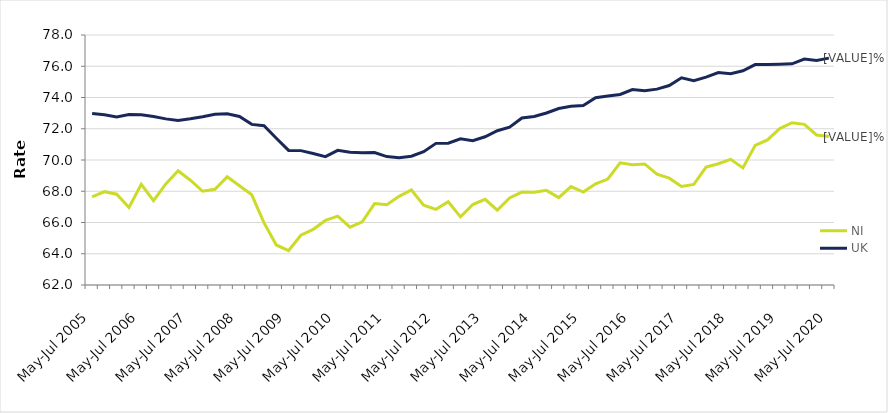
| Category | NI | UK |
|---|---|---|
| May-Jul 2005 | 67.645 | 72.97 |
| Aug-Oct 2005 | 67.974 | 72.901 |
| Nov-Jan 2006 | 67.813 | 72.757 |
| Feb-Apr 2006 | 66.965 | 72.911 |
| May-Jul 2006 | 68.442 | 72.894 |
| Aug-Oct 2006 | 67.397 | 72.779 |
| Nov-Jan 2007 | 68.468 | 72.632 |
| Feb-Apr 2007 | 69.313 | 72.535 |
| May-Jul 2007 | 68.706 | 72.637 |
| Aug-Oct 2007 | 68 | 72.767 |
| Nov-Jan 2008 | 68.125 | 72.932 |
| Feb-Apr 2008 | 68.922 | 72.964 |
| May-Jul 2008 | 68.347 | 72.787 |
| Aug-Oct 2008 | 67.774 | 72.28 |
| Nov-Jan 2009 | 65.977 | 72.194 |
| Feb-Apr 2009 | 64.562 | 71.396 |
| May-Jul 2009 | 64.206 | 70.615 |
| Aug-Oct 2009 | 65.187 | 70.6 |
| Nov-Jan 2010 | 65.558 | 70.416 |
| Feb-Apr 2010 | 66.133 | 70.214 |
| May-Jul 2010 | 66.41 | 70.621 |
| Aug-Oct 2010 | 65.703 | 70.49 |
| Nov-Jan 2011 | 66.046 | 70.469 |
| Feb-Apr 2011 | 67.208 | 70.482 |
| May-Jul 2011 | 67.131 | 70.22 |
| Aug-Oct 2011 | 67.672 | 70.144 |
| Nov-Jan 2012 | 68.081 | 70.24 |
| Feb-Apr 2012 | 67.113 | 70.528 |
| May-Jul 2012 | 66.844 | 71.064 |
| Aug-Oct 2012 | 67.332 | 71.072 |
| Nov-Jan 2013 | 66.36 | 71.357 |
| Feb-Apr 2013 | 67.149 | 71.239 |
| May-Jul 2013 | 67.483 | 71.485 |
| Aug-Oct 2013 | 66.795 | 71.875 |
| Nov-Jan 2014 | 67.576 | 72.104 |
| Feb-Apr 2014 | 67.944 | 72.69 |
| May-Jul 2014 | 67.935 | 72.784 |
| Aug-Oct 2014 | 68.055 | 73.007 |
| Nov-Jan 2015 | 67.592 | 73.298 |
| Feb-Apr 2015 | 68.303 | 73.434 |
| May-Jul 2015 | 67.945 | 73.481 |
| Aug-Oct 2015 | 68.475 | 73.98 |
| Nov-Jan 2016 | 68.782 | 74.089 |
| Feb-Apr 2016 | 69.815 | 74.191 |
| May-Jul 2016 | 69.697 | 74.505 |
| Aug-Oct 2016 | 69.747 | 74.433 |
| Nov-Jan 2017 | 69.088 | 74.536 |
| Feb-Apr 2017 | 68.838 | 74.767 |
| May-Jul 2017 | 68.309 | 75.264 |
| Aug-Oct 2017 | 68.433 | 75.076 |
| Nov-Jan 2018 | 69.545 | 75.303 |
| Feb-Apr 2018 | 69.758 | 75.594 |
| May-Jul 2018 | 70.044 | 75.519 |
| Aug-Oct 2018 | 69.495 | 75.712 |
| Nov-Jan 2019 | 70.937 | 76.106 |
| Feb-Apr 2019 | 71.289 | 76.113 |
| May-Jul 2019 | 72.012 | 76.126 |
| Aug-Oct 2019 | 72.383 | 76.153 |
| Nov-Jan 2020 | 72.284 | 76.457 |
| Feb-Apr 2020 | 71.603 | 76.369 |
| May-Jul 2020 | 71.5 | 76.519 |